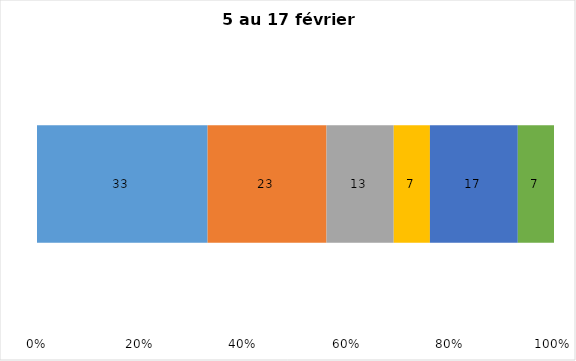
| Category | Plusieurs fois par jour | Une fois par jour | Quelques fois par semaine   | Une fois par semaine ou moins   |  Jamais   |  Je n’utilise pas les médias sociaux |
|---|---|---|---|---|---|---|
| 0 | 33 | 23 | 13 | 7 | 17 | 7 |